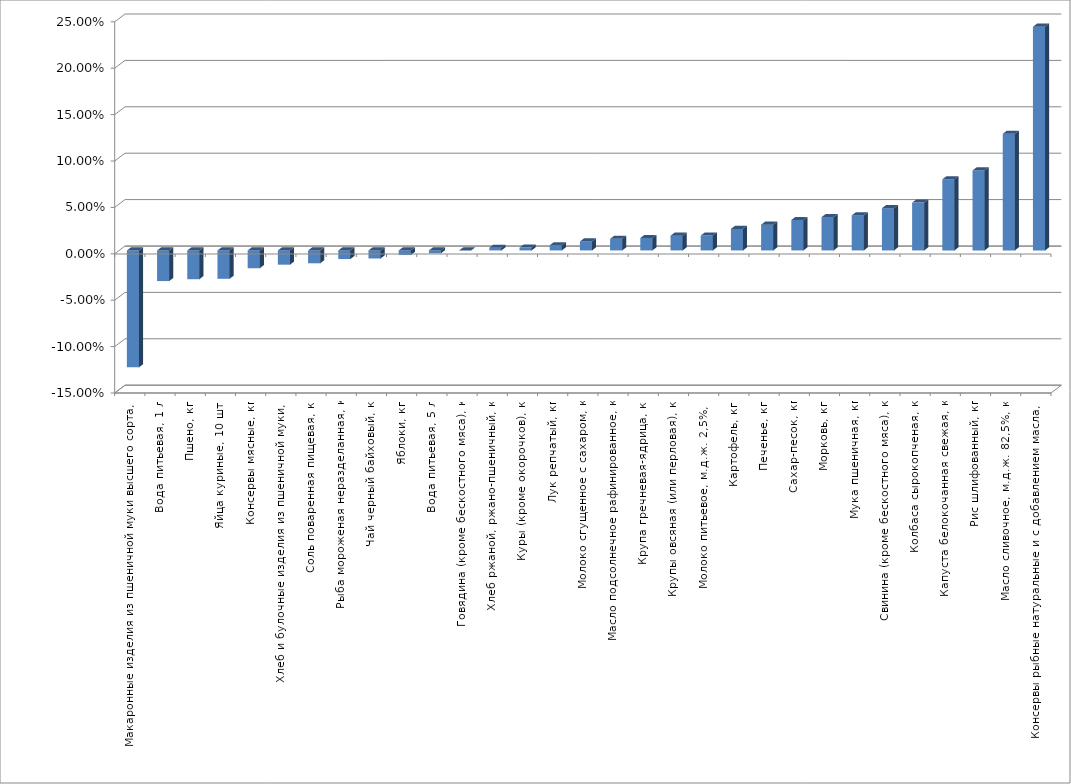
| Category | Series 0 |
|---|---|
| Макаронные изделия из пшеничной муки высшего сорта, кг | -0.126 |
| Вода питьевая, 1 л | -0.033 |
| Пшено, кг | -0.031 |
| Яйца куриные, 10 шт. | -0.031 |
| Консервы мясные, кг | -0.019 |
| Хлеб и булочные изделия из пшеничной муки, кг | -0.015 |
| Соль поваренная пищевая, кг | -0.014 |
| Рыба мороженая неразделанная, кг | -0.009 |
| Чай черный байховый, кг | -0.009 |
| Яблоки, кг | -0.005 |
| Вода питьевая, 5 л | -0.003 |
| Говядина (кроме бескостного мяса), кг | 0 |
| Хлеб ржаной, ржано-пшеничный, кг | 0.003 |
| Куры (кроме окорочков), кг | 0.003 |
| Лук репчатый, кг | 0.006 |
| Молоко сгущенное с сахаром, кг | 0.01 |
| Масло подсолнечное рафинированное, кг | 0.013 |
| Крупа гречневая-ядрица, кг | 0.013 |
| Крупы овсяная (или перловая), кг | 0.016 |
| Молоко питьевое, м.д.ж. 2,5%, л | 0.016 |
| Картофель, кг | 0.023 |
| Печенье, кг | 0.028 |
| Сахар-песок, кг | 0.033 |
| Морковь, кг | 0.036 |
| Мука пшеничная, кг | 0.038 |
| Свинина (кроме бескостного мяса), кг | 0.046 |
| Колбаса сырокопченая, кг | 0.052 |
| Капуста белокочанная свежая, кг | 0.077 |
| Рис шлифованный, кг | 0.086 |
| Масло сливочное, м.д.ж. 82,5%, кг | 0.126 |
| Консервы рыбные натуральные и с добавлением масла, кг | 0.241 |